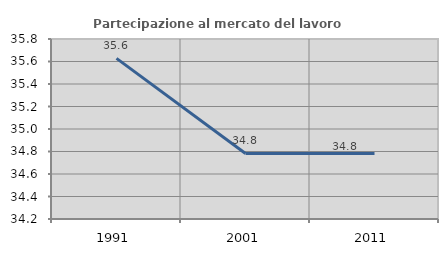
| Category | Partecipazione al mercato del lavoro  femminile |
|---|---|
| 1991.0 | 35.628 |
| 2001.0 | 34.783 |
| 2011.0 | 34.783 |